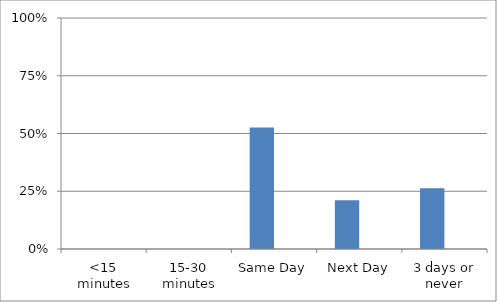
| Category | Series 0 | Series 1 |
|---|---|---|
| <15 minutes | 0 | 0 |
| 15-30 minutes | 0 | 0 |
| Same Day | 0.526 | 0 |
| Next Day | 0.211 | 0 |
| 3 days or never | 0.263 | 0 |